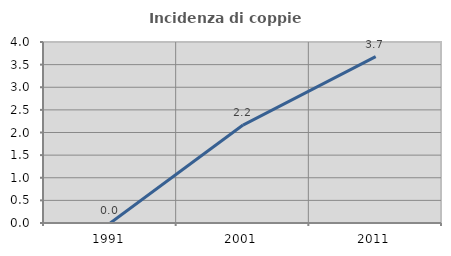
| Category | Incidenza di coppie miste |
|---|---|
| 1991.0 | 0 |
| 2001.0 | 2.165 |
| 2011.0 | 3.678 |